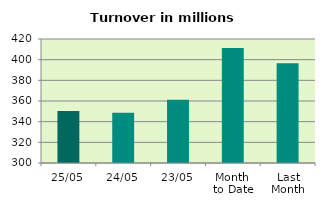
| Category | Series 0 |
|---|---|
| 25/05 | 350.244 |
| 24/05 | 348.583 |
| 23/05 | 361.105 |
| Month 
to Date | 411.258 |
| Last
Month | 396.429 |